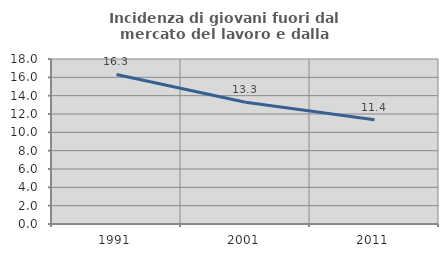
| Category | Incidenza di giovani fuori dal mercato del lavoro e dalla formazione  |
|---|---|
| 1991.0 | 16.318 |
| 2001.0 | 13.291 |
| 2011.0 | 11.364 |